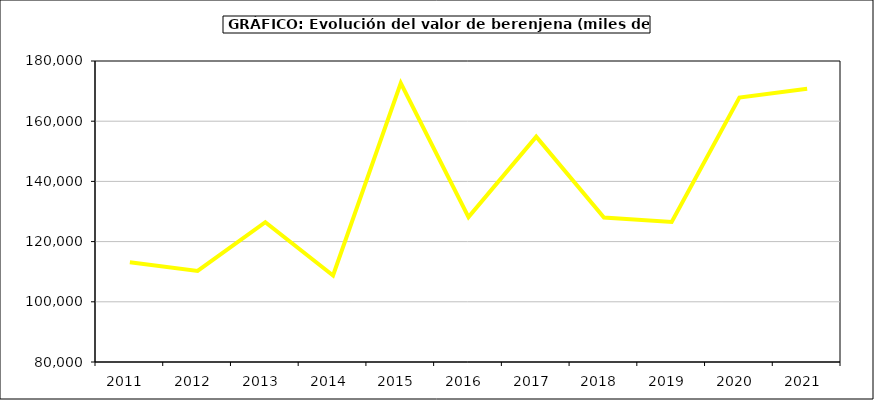
| Category | Valor |
|---|---|
| 2011.0 | 113149.264 |
| 2012.0 | 110271.616 |
| 2013.0 | 126461.496 |
| 2014.0 | 108753.977 |
| 2015.0 | 172694 |
| 2016.0 | 128140 |
| 2017.0 | 154840.085 |
| 2018.0 | 127980.525 |
| 2019.0 | 126544.365 |
| 2020.0 | 167880.78 |
| 2021.0 | 170769.748 |